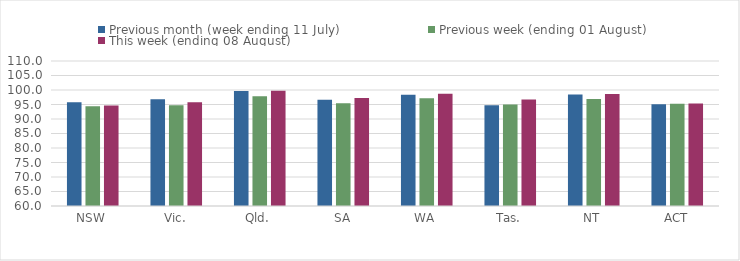
| Category | Previous month (week ending 11 July) | Previous week (ending 01 August) | This week (ending 08 August) |
|---|---|---|---|
| NSW | 95.767 | 94.385 | 94.632 |
| Vic. | 96.83 | 94.746 | 95.752 |
| Qld. | 99.692 | 97.808 | 99.725 |
| SA | 96.673 | 95.472 | 97.218 |
| WA | 98.341 | 97.186 | 98.693 |
| Tas. | 94.777 | 94.977 | 96.684 |
| NT | 98.452 | 96.931 | 98.606 |
| ACT | 95.078 | 95.3 | 95.314 |